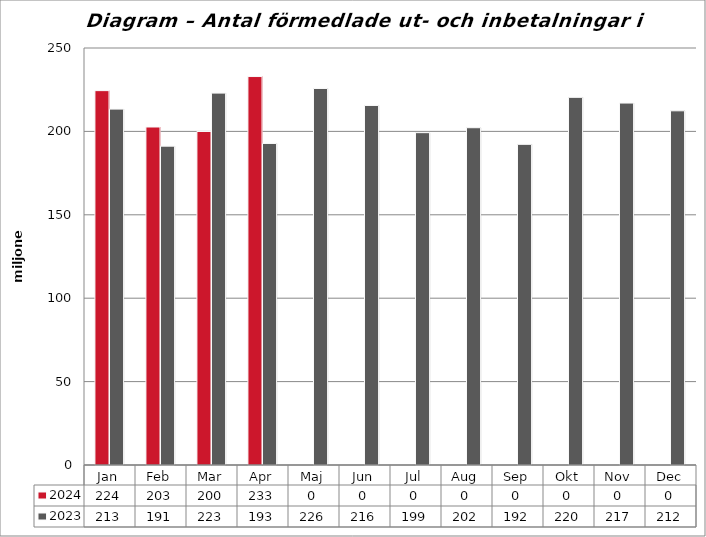
| Category | <fMaxÅr> | <fFgÅr> |
|---|---|---|
| Jan | 0 | 0 |
| Feb | 0 | 0 |
| Mar | 0 | 0 |
| Apr | 0 | 0 |
| Maj | 0 | 0 |
| Jun | 0 | 0 |
| Jul | 0 | 0 |
| Aug | 0 | 0 |
| Sep | 0 | 0 |
| Okt | 0 | 0 |
| Nov | 0 | 0 |
| Dec | 0 | 0 |